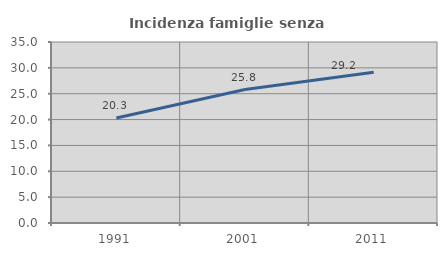
| Category | Incidenza famiglie senza nuclei |
|---|---|
| 1991.0 | 20.32 |
| 2001.0 | 25.814 |
| 2011.0 | 29.16 |